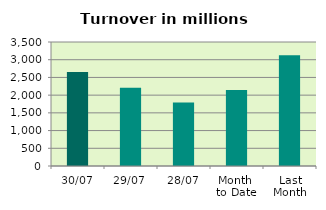
| Category | Series 0 |
|---|---|
| 30/07 | 2650.801 |
| 29/07 | 2206.061 |
| 28/07 | 1794.79 |
| Month 
to Date | 2146.757 |
| Last
Month | 3125.17 |